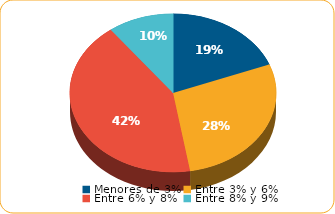
| Category | Series 0 |
|---|---|
| Menores de 3% | 2488.1 |
| Entre 3% y 6% | 3665.1 |
| Entre 6% y 8% | 5503.9 |
| Entre 8% y 9% | 1337.8 |